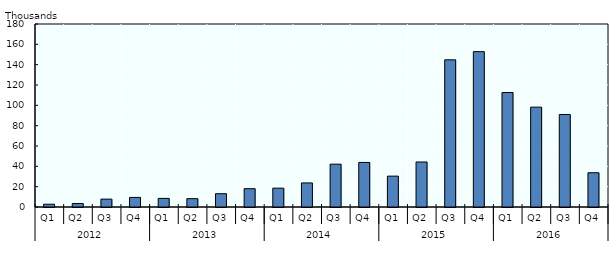
| Category | Series 2 |
|---|---|
| 0 | 2735 |
| 1 | 3418 |
| 2 | 7758 |
| 3 | 9435 |
| 4 | 8462 |
| 5 | 8205 |
| 6 | 13081 |
| 7 | 18014 |
| 8 | 18537 |
| 9 | 23683 |
| 10 | 42126 |
| 11 | 43819 |
| 12 | 30360 |
| 13 | 44286 |
| 14 | 144767 |
| 15 | 152827 |
| 16 | 112597 |
| 17 | 98230 |
| 18 | 90996 |
| 19 | 33691 |